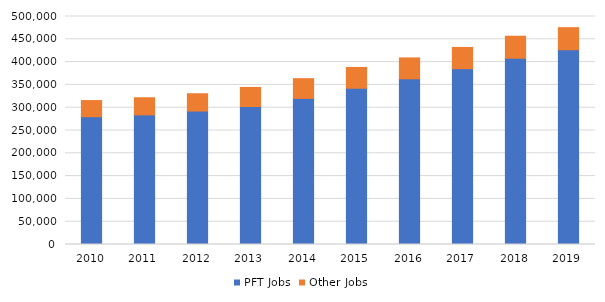
| Category | PFT Jobs | Other Jobs |
|---|---|---|
| 2010.0 | 280211 | 35448 |
| 2011.0 | 284240 | 37547 |
| 2012.0 | 292659 | 37962 |
| 2013.0 | 302600 | 41861 |
| 2014.0 | 320433 | 43230 |
| 2015.0 | 342697 | 45608 |
| 2016.0 | 363390 | 45785 |
| 2017.0 | 385590 | 46609 |
| 2018.0 | 408518 | 48226 |
| 2019.0 | 427151 | 48354 |